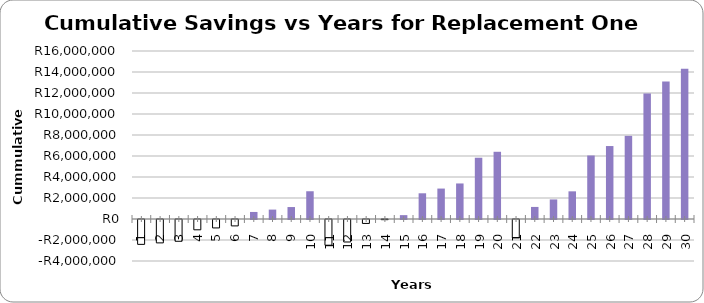
| Category | Cumulative Savings |
|---|---|
| 1.0 | -2368600 |
| 2.0 | -2226688 |
| 3.0 | -2073423.04 |
| 4.0 | -981796.883 |
| 5.0 | -803028.634 |
| 6.0 | -609958.925 |
| 7.0 | 670632.874 |
| 8.0 | 895829.383 |
| 9.0 | 1139041.613 |
| 10.0 | 2642773.393 |
| 11.0 | -2448896.13 |
| 12.0 | -2142518.766 |
| 13.0 | -374946.152 |
| 14.0 | -17587.594 |
| 15.0 | 368359.648 |
| 16.0 | 2448325.213 |
| 17.0 | 2898494.076 |
| 18.0 | 3384676.449 |
| 19.0 | 5835048.798 |
| 20.0 | 6402131.917 |
| 21.0 | -1741300.741 |
| 22.0 | 1148915.081 |
| 23.0 | 1863276.491 |
| 24.0 | 2634786.814 |
| 25.0 | 6048097.918 |
| 26.0 | 6947987.559 |
| 27.0 | 7919868.371 |
| 28.0 | 11956264.706 |
| 29.0 | 13089866.485 |
| 30.0 | 14314156.407 |